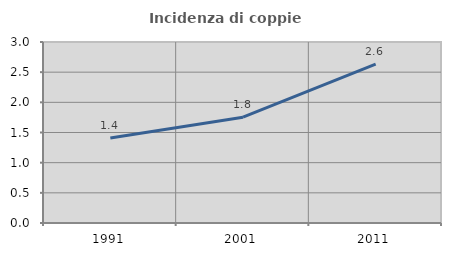
| Category | Incidenza di coppie miste |
|---|---|
| 1991.0 | 1.408 |
| 2001.0 | 1.754 |
| 2011.0 | 2.632 |